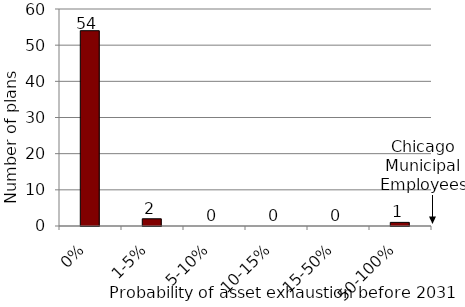
| Category | Series 0 |
|---|---|
| 0% | 54 |
| 1-5% | 2 |
| 5-10% | 0 |
| 10-15% | 0 |
| 15-50% | 0 |
| 50-100% | 1 |